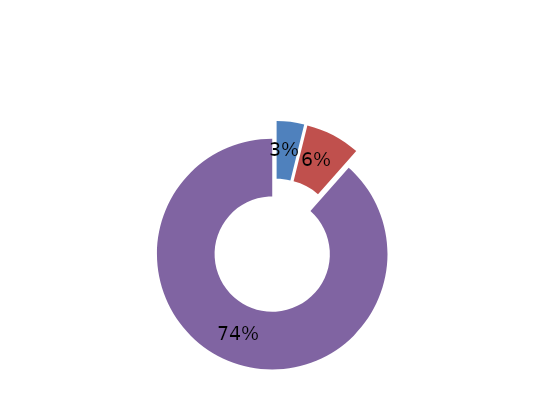
| Category | Series 0 |
|---|---|
| Si, tengo una empresa/negocio/finca | 0.032 |
| Si, trabajo como empleado | 0.065 |
| Si, trabajo en un negocio familiar sin remuneración | 0 |
| No | 0.742 |